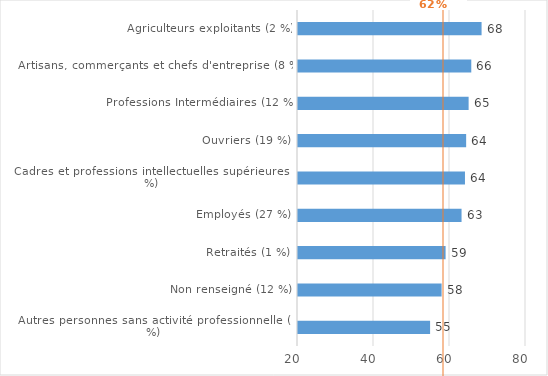
| Category | % en emploi |
|---|---|
| Autres personnes sans activité professionnelle (11 %) | 54.76 |
| Non renseigné (12 %) | 57.79 |
| Retraités (1 %) | 58.84 |
| Employés (27 %) | 63.04 |
| Cadres et professions intellectuelles supérieures (8 %) | 63.94 |
| Ouvriers (19 %) | 64.25 |
| Professions Intermédiaires (12 %) | 64.9 |
| Artisans, commerçants et chefs d'entreprise (8 %) | 65.6 |
| Agriculteurs exploitants (2 %) | 68.31 |